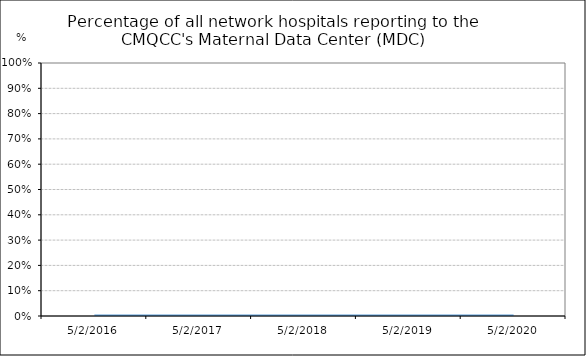
| Category | % | Date / Observation |
|---|---|---|
| 5/2/16 | 0 | 5/2/16 |
| 5/2/17 | 0 | 5/2/17 |
| 5/2/18 | 0 | 5/2/18 |
| 5/2/19 | 0 | 5/2/19 |
| 5/2/20 | 0 | 5/2/20 |